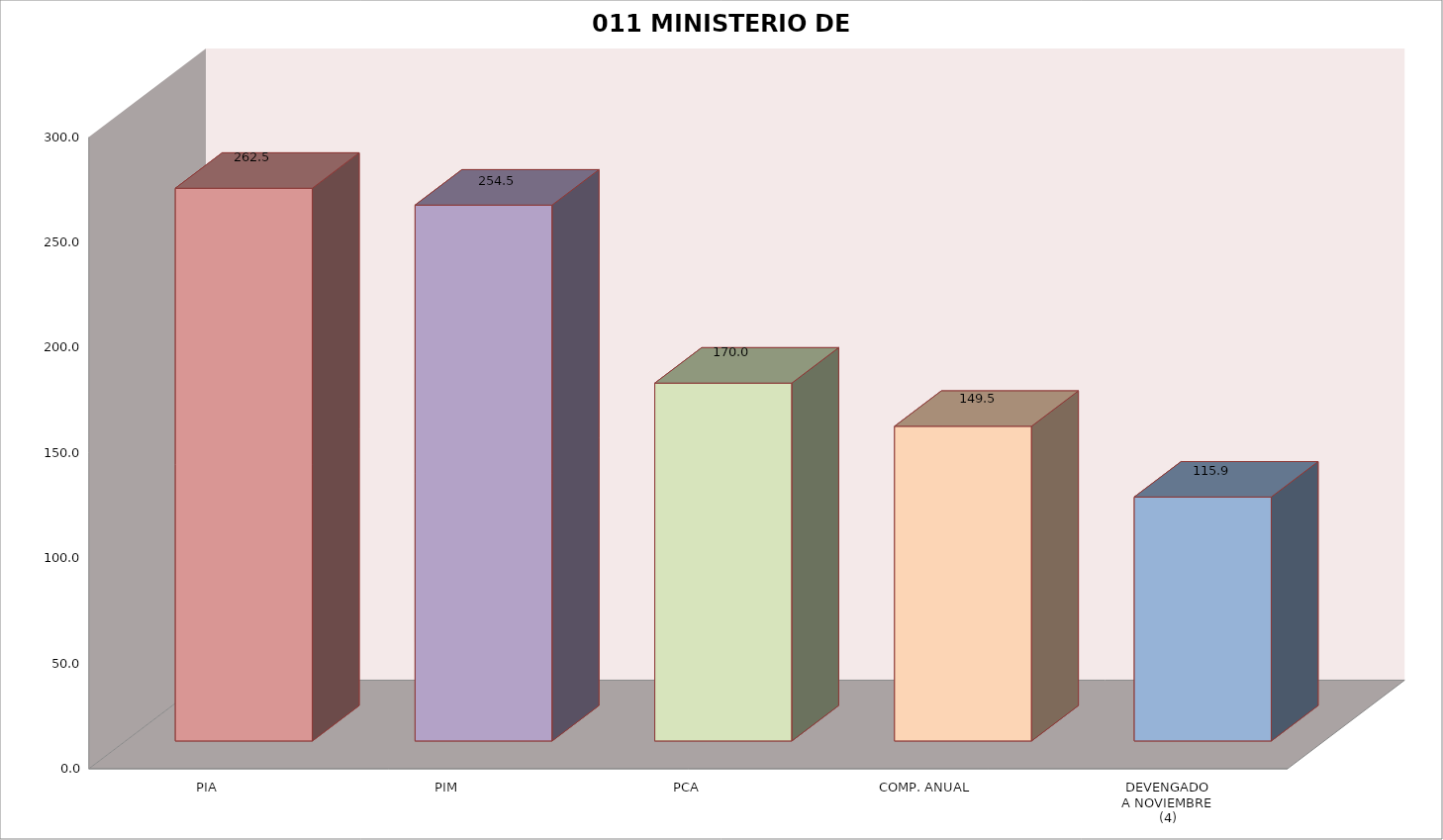
| Category | 011 MINISTERIO DE SALUD |
|---|---|
| PIA | 262.508 |
| PIM | 254.515 |
| PCA | 169.967 |
| COMP. ANUAL | 149.458 |
| DEVENGADO
A NOVIEMBRE
(4) | 115.867 |